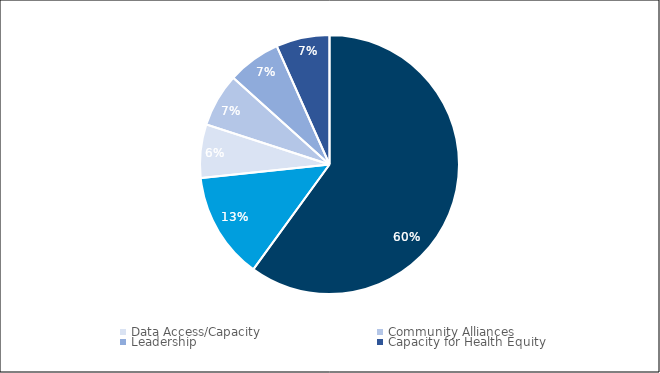
| Category | Series 0 |
|---|---|
| Resources | 9 |
| Workforce | 2 |
| Data Access/Capacity | 1 |
| Community Alliances | 1 |
| Leadership | 1 |
| Capacity for Health Equity | 1 |